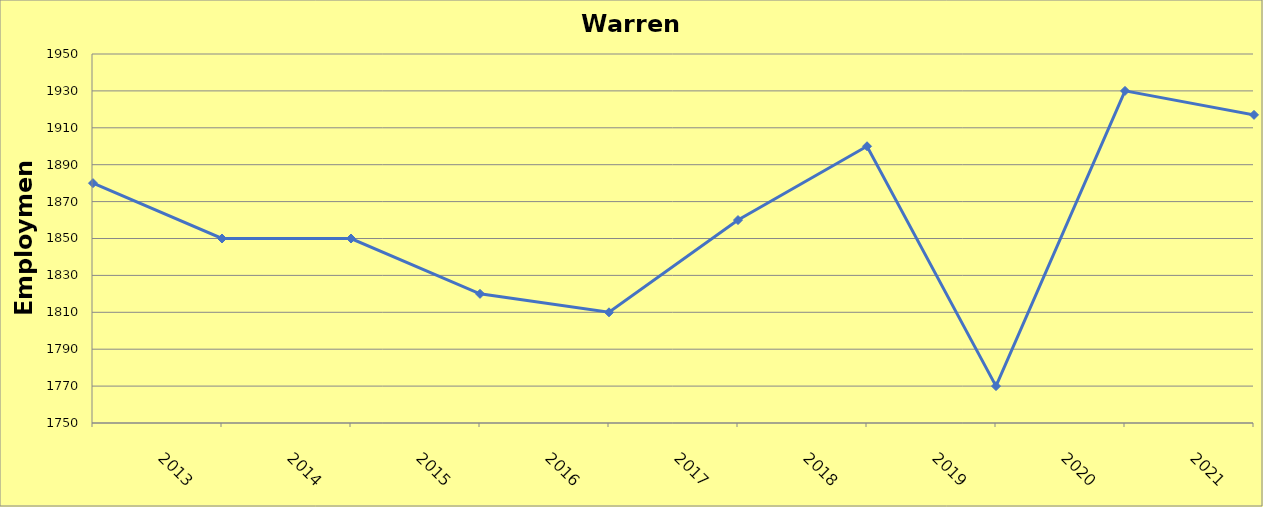
| Category | Warren County |
|---|---|
| 2013.0 | 1880 |
| 2014.0 | 1850 |
| 2015.0 | 1850 |
| 2016.0 | 1820 |
| 2017.0 | 1810 |
| 2018.0 | 1860 |
| 2019.0 | 1900 |
| 2020.0 | 1770 |
| 2021.0 | 1930 |
| 2022.0 | 1917 |